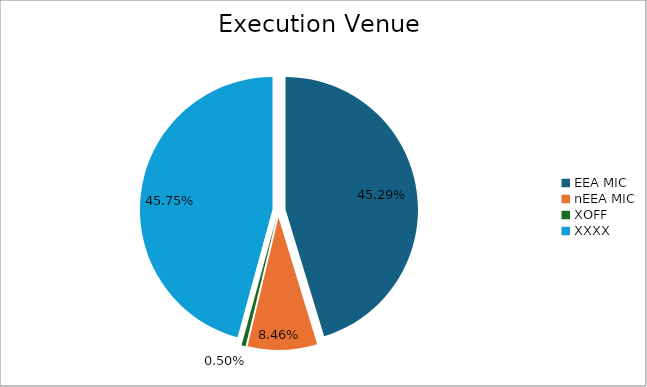
| Category | Series 0 |
|---|---|
| EEA MIC | 6392471.538 |
| nEEA MIC | 1194294.083 |
| XOFF | 70738.38 |
| XXXX | 6457940.225 |